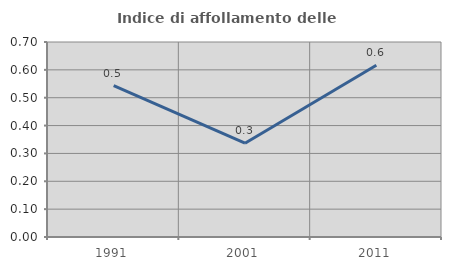
| Category | Indice di affollamento delle abitazioni  |
|---|---|
| 1991.0 | 0.543 |
| 2001.0 | 0.337 |
| 2011.0 | 0.616 |